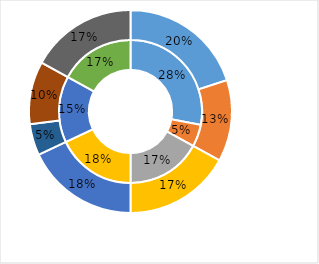
| Category | Series 0 | Series 1 |
|---|---|---|
| Company A | 0.28 | 0.2 |
| Company B | 0.05 | 0.13 |
| Company C | 0.17 | 0 |
| Company D | 0.18 | 0.17 |
| Company E | 0.15 | 0.18 |
| Other | 0.17 | 0 |